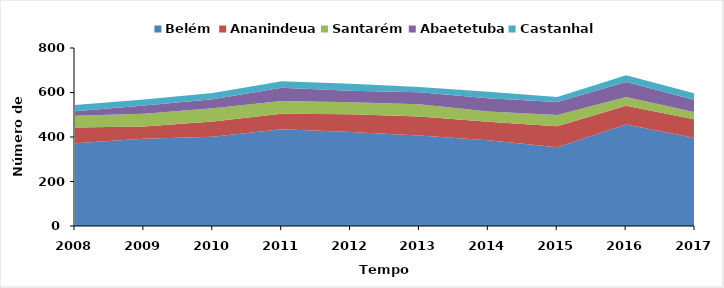
| Category | Belém | Ananindeua | Santarém | Abaetetuba | Castanhal |
|---|---|---|---|---|---|
| 2008.0 | 372 | 71 | 52 | 21 | 28 |
| 2009.0 | 392 | 55 | 58 | 37 | 26 |
| 2010.0 | 401 | 69 | 59 | 41 | 28 |
| 2011.0 | 435 | 69 | 58 | 59 | 30 |
| 2012.0 | 422 | 80 | 54 | 52 | 31 |
| 2013.0 | 407 | 85 | 55 | 54 | 24 |
| 2014.0 | 385 | 83 | 47 | 59 | 29 |
| 2015.0 | 354 | 94 | 51 | 58 | 23 |
| 2016.0 | 456 | 84 | 40 | 67 | 30 |
| 2017.0 | 396 | 83 | 32 | 55 | 30 |